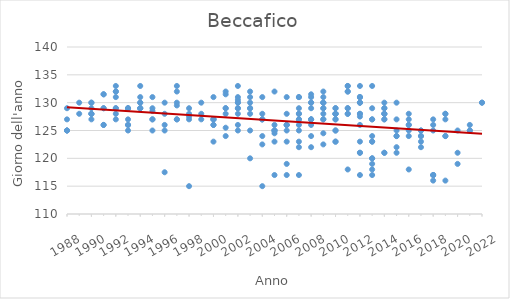
| Category | Series 0 |
|---|---|
| 1988.0 | 129 |
| 1988.0 | 125 |
| 1988.0 | 125 |
| 1988.0 | 125 |
| 1988.0 | 127 |
| 1989.0 | 128 |
| 1989.0 | 130 |
| 1990.0 | 130 |
| 1990.0 | 128 |
| 1990.0 | 127 |
| 1990.0 | 128 |
| 1990.0 | 130 |
| 1990.0 | 128 |
| 1990.0 | 129 |
| 1991.0 | 126 |
| 1991.0 | 129 |
| 1991.0 | 129 |
| 1991.0 | 131.5 |
| 1991.0 | 126 |
| 1991.0 | 131.5 |
| 1992.0 | 132 |
| 1992.0 | 128 |
| 1992.0 | 133 |
| 1992.0 | 127 |
| 1992.0 | 129 |
| 1992.0 | 132 |
| 1992.0 | 129 |
| 1992.0 | 131 |
| 1993.0 | 129 |
| 1993.0 | 127 |
| 1993.0 | 125 |
| 1993.0 | 126 |
| 1993.0 | 129 |
| 1993.0 | 126 |
| 1993.0 | 129 |
| 1994.0 | 130 |
| 1994.0 | 129 |
| 1994.0 | 129 |
| 1994.0 | 129 |
| 1994.0 | 131 |
| 1994.0 | 133 |
| 1994.0 | 130 |
| 1995.0 | 129 |
| 1995.0 | 128.5 |
| 1995.0 | 127 |
| 1995.0 | 125 |
| 1995.0 | 131 |
| 1995.0 | 127 |
| 1996.0 | 128 |
| 1996.0 | 117.5 |
| 1996.0 | 126 |
| 1996.0 | 130 |
| 1996.0 | 125 |
| 1997.0 | 127 |
| 1997.0 | 133 |
| 1997.0 | 127 |
| 1997.0 | 129.5 |
| 1997.0 | 132 |
| 1997.0 | 130 |
| 1998.0 | 128 |
| 1998.0 | 129 |
| 1998.0 | 127 |
| 1998.0 | 115 |
| 1998.0 | 127.5 |
| 1999.0 | 127 |
| 1999.0 | 128 |
| 1999.0 | 130 |
| 2000.0 | 126 |
| 2000.0 | 131 |
| 2000.0 | 127 |
| 2000.0 | 127 |
| 2000.0 | 123 |
| 2000.0 | 127 |
| 2000.0 | 126 |
| 2001.0 | 125.5 |
| 2001.0 | 132 |
| 2001.0 | 129 |
| 2001.0 | 128 |
| 2001.0 | 131.5 |
| 2001.0 | 124 |
| 2001.0 | 129 |
| 2002.0 | 125 |
| 2002.0 | 133 |
| 2002.0 | 128 |
| 2002.0 | 130 |
| 2002.0 | 130.5 |
| 2002.0 | 131 |
| 2002.0 | 129 |
| 2002.0 | 126 |
| 2002.0 | 129 |
| 2002.0 | 130 |
| 2003.0 | 129 |
| 2003.0 | 120 |
| 2003.0 | 132 |
| 2003.0 | 130 |
| 2003.0 | 128 |
| 2003.0 | 131 |
| 2003.0 | 125 |
| 2003.0 | 129 |
| 2004.0 | 127 |
| 2004.0 | 115 |
| 2004.0 | 128 |
| 2004.0 | 131 |
| 2004.0 | 124 |
| 2004.0 | 127 |
| 2004.0 | 122.5 |
| 2004.0 | 127 |
| 2005.0 | 126 |
| 2005.0 | 117 |
| 2005.0 | 125 |
| 2005.0 | 124.5 |
| 2005.0 | 132 |
| 2005.0 | 123 |
| 2005.0 | 125 |
| 2005.0 | 125 |
| 2006.0 | 126 |
| 2006.0 | 119 |
| 2006.0 | 117 |
| 2006.0 | 126 |
| 2006.0 | 126 |
| 2006.0 | 131 |
| 2006.0 | 128 |
| 2006.0 | 125 |
| 2006.0 | 123 |
| 2007.0 | 125 |
| 2007.0 | 127 |
| 2007.0 | 126 |
| 2007.0 | 117 |
| 2007.0 | 127 |
| 2007.0 | 122 |
| 2007.0 | 131 |
| 2007.0 | 128 |
| 2007.0 | 129 |
| 2007.0 | 128 |
| 2007.0 | 123 |
| 2007.0 | 131 |
| 2008.0 | 124 |
| 2008.0 | 126 |
| 2008.0 | 122 |
| 2008.0 | 127 |
| 2008.0 | 127 |
| 2008.0 | 131.5 |
| 2008.0 | 129 |
| 2008.0 | 130 |
| 2008.0 | 130 |
| 2008.0 | 127 |
| 2008.0 | 131 |
| 2009.0 | 128 |
| 2009.0 | 129 |
| 2009.0 | 127 |
| 2009.0 | 130 |
| 2009.0 | 124.5 |
| 2009.0 | 130 |
| 2009.0 | 122.5 |
| 2009.0 | 131 |
| 2009.0 | 129 |
| 2009.0 | 127 |
| 2009.0 | 130 |
| 2009.0 | 132 |
| 2010.0 | 123 |
| 2010.0 | 127 |
| 2010.0 | 128 |
| 2010.0 | 123 |
| 2010.0 | 128 |
| 2010.0 | 128 |
| 2010.0 | 125 |
| 2010.0 | 129 |
| 2010.0 | 127 |
| 2010.0 | 129 |
| 2010.0 | 125 |
| 2010.0 | 128 |
| 2011.0 | 129 |
| 2011.0 | 133 |
| 2011.0 | 133 |
| 2011.0 | 132 |
| 2011.0 | 118 |
| 2011.0 | 128 |
| 2011.0 | 129 |
| 2011.0 | 132 |
| 2011.0 | 128 |
| 2012.0 | 128 |
| 2012.0 | 126 |
| 2012.0 | 131 |
| 2012.0 | 121 |
| 2012.0 | 123 |
| 2012.0 | 133 |
| 2012.0 | 130 |
| 2012.0 | 130 |
| 2012.0 | 127.5 |
| 2012.0 | 131 |
| 2012.0 | 117 |
| 2012.0 | 128 |
| 2012.0 | 131 |
| 2012.0 | 121 |
| 2012.0 | 130 |
| 2013.0 | 117 |
| 2013.0 | 133 |
| 2013.0 | 129 |
| 2013.0 | 120 |
| 2013.0 | 118 |
| 2013.0 | 124 |
| 2013.0 | 119 |
| 2013.0 | 123 |
| 2013.0 | 120 |
| 2013.0 | 127 |
| 2013.0 | 123 |
| 2013.0 | 127 |
| 2014.0 | 129 |
| 2014.0 | 129 |
| 2014.0 | 121 |
| 2014.0 | 128 |
| 2014.0 | 130 |
| 2014.0 | 128 |
| 2014.0 | 128 |
| 2014.0 | 121 |
| 2014.0 | 127 |
| 2014.0 | 127 |
| 2015.0 | 124 |
| 2015.0 | 124 |
| 2015.0 | 130 |
| 2015.0 | 121 |
| 2015.0 | 125 |
| 2015.0 | 122 |
| 2015.0 | 127 |
| 2016.0 | 125 |
| 2016.0 | 126 |
| 2016.0 | 128 |
| 2016.0 | 127 |
| 2016.0 | 118 |
| 2016.0 | 126 |
| 2016.0 | 124 |
| 2017.0 | 123 |
| 2017.0 | 124 |
| 2017.0 | 124 |
| 2017.0 | 125 |
| 2017.0 | 125 |
| 2017.0 | 122 |
| 2018.0 | 117 |
| 2018.0 | 117 |
| 2018.0 | 125 |
| 2018.0 | 127 |
| 2018.0 | 126 |
| 2018.0 | 116 |
| 2018.0 | 117 |
| 2019.0 | 128 |
| 2019.0 | 124 |
| 2019.0 | 127 |
| 2019.0 | 124 |
| 2019.0 | 116 |
| 2019.0 | 128 |
| 2020.0 | 121 |
| 2020.0 | 119 |
| 2020.0 | 125 |
| 2021.0 | 125 |
| 2021.0 | 126 |
| 2021.0 | 125 |
| 2022.0 | 130 |
| 2022.0 | 130 |